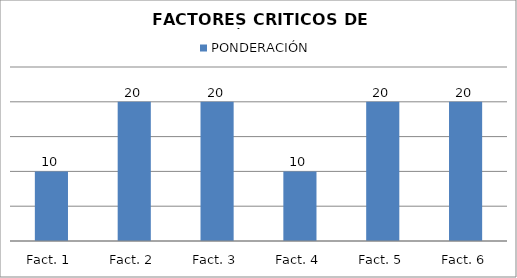
| Category | PONDERACIÓN |
|---|---|
| Fact. 1 | 10 |
| Fact. 2 | 20 |
| Fact. 3 | 20 |
| Fact. 4 | 10 |
| Fact. 5 | 20 |
| Fact. 6 | 20 |